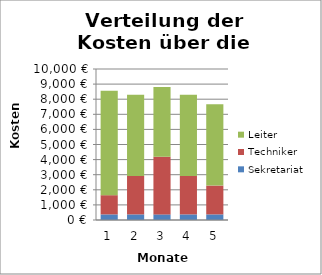
| Category | Sekretariat | Techniker | Leiter |
|---|---|---|---|
| 1.0 | 371.211 | 1272.722 | 6920.426 |
| 2.0 | 371.211 | 2545.444 | 5382.554 |
| 3.0 | 371.211 | 3818.166 | 4613.617 |
| 4.0 | 371.211 | 2545.444 | 5382.554 |
| 5.0 | 371.211 | 1909.083 | 5382.554 |